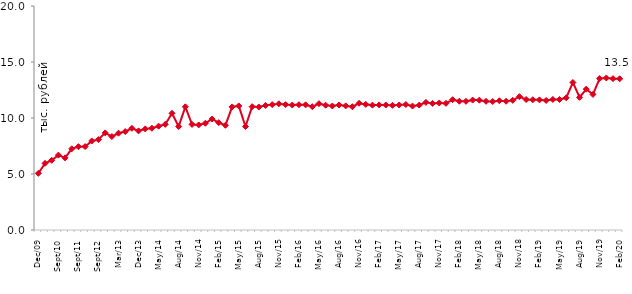
| Category | медианное значение среднедушевого располагаемого дохода, тыс. руб. |
|---|---|
| 2009-12-01 | 5.058 |
| 2010-04-01 | 5.949 |
| 2010-06-01 | 6.224 |
| 2010-09-01 | 6.686 |
| 2010-12-01 | 6.44 |
| 2011-07-01 | 7.25 |
| 2011-09-01 | 7.441 |
| 2011-12-01 | 7.446 |
| 2012-07-01 | 7.95 |
| 2012-09-01 | 8.071 |
| 2012-11-01 | 8.673 |
| 2012-12-01 | 8.345 |
| 2013-03-01 | 8.644 |
| 2013-06-01 | 8.789 |
| 2013-09-01 | 9.079 |
| 2013-12-01 | 8.849 |
| 2014-02-01 | 9.025 |
| 2014-04-01 | 9.087 |
| 2014-05-01 | 9.273 |
| 2014-06-01 | 9.432 |
| 2014-07-01 | 10.422 |
| 2014-08-01 | 9.241 |
| 2014-09-01 | 11 |
| 2014-10-01 | 9.426 |
| 2014-11-01 | 9.381 |
| 2014-12-01 | 9.532 |
| 2015-01-01 | 9.908 |
| 2015-02-01 | 9.585 |
| 2015-03-01 | 9.35 |
| 2015-04-01 | 10.991 |
| 2015-05-01 | 11.076 |
| 2015-06-01 | 9.237 |
| 2015-07-01 | 11.013 |
| 2015-08-01 | 10.981 |
| 2015-09-01 | 11.124 |
| 2015-10-01 | 11.195 |
| 2015-11-01 | 11.268 |
| 2015-12-01 | 11.194 |
| 2016-01-01 | 11.158 |
| 2016-02-01 | 11.188 |
| 2016-03-01 | 11.174 |
| 2016-04-01 | 11.01 |
| 2016-05-01 | 11.278 |
| 2016-06-01 | 11.142 |
| 2016-07-01 | 11.072 |
| 2016-08-01 | 11.165 |
| 2016-09-01 | 11.082 |
| 2016-10-01 | 11.008 |
| 2016-11-01 | 11.313 |
| 2016-12-01 | 11.216 |
| 2017-01-01 | 11.146 |
| 2017-02-01 | 11.17 |
| 2017-03-01 | 11.162 |
| 2017-04-01 | 11.133 |
| 2017-05-01 | 11.163 |
| 2017-06-01 | 11.207 |
| 2017-07-01 | 11.066 |
| 2017-08-01 | 11.153 |
| 2017-09-01 | 11.395 |
| 2017-10-01 | 11.301 |
| 2017-11-01 | 11.342 |
| 2017-12-01 | 11.31 |
| 2018-01-01 | 11.637 |
| 2018-02-01 | 11.497 |
| 2018-03-01 | 11.49 |
| 2018-04-01 | 11.601 |
| 2018-05-01 | 11.592 |
| 2018-06-01 | 11.491 |
| 2018-07-01 | 11.471 |
| 2018-08-01 | 11.541 |
| 2018-09-01 | 11.497 |
| 2018-10-01 | 11.578 |
| 2018-11-01 | 11.906 |
| 2018-12-01 | 11.648 |
| 2019-01-01 | 11.629 |
| 2019-02-01 | 11.617 |
| 2019-03-01 | 11.566 |
| 2019-04-01 | 11.659 |
| 2019-05-01 | 11.653 |
| 2019-06-01 | 11.805 |
| 2019-07-01 | 13.174 |
| 2019-08-01 | 11.844 |
| 2019-09-01 | 12.577 |
| 2019-10-01 | 12.107 |
| 2019-11-01 | 13.523 |
| 2019-12-01 | 13.573 |
| 2020-01-01 | 13.516 |
| 2020-02-01 | 13.502 |